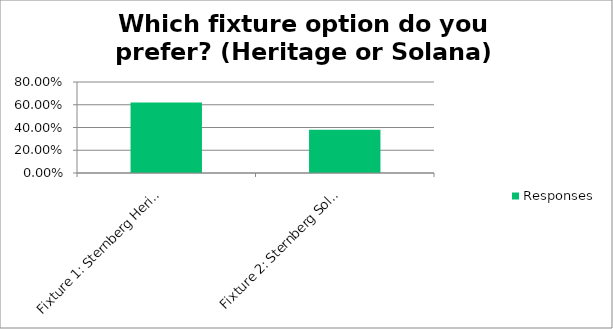
| Category | Responses |
|---|---|
| Fixture 1: Sternberg Heritage https://surveymonkey-assets.s3.amazonaws.com/survey/517155112/rte/e666c66a-51af-4099-a42b-d2699aed65a8.png | 0.62 |
| Fixture 2: Sternberg Solana https://surveymonkey-assets.s3.amazonaws.com/survey/517155112/rte/574d3e01-277a-4aeb-8d24-1b156eb7dad7.png | 0.38 |